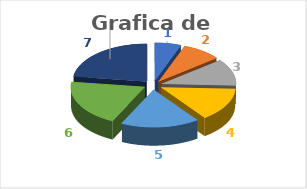
| Category | Series 0 | Series 1 | Series 2 | Series 3 | Series 4 |
|---|---|---|---|---|---|
| 0 | 14 | 20 | 1 | 2 | 7.2 |
| 1 | 21 | 27 | 5 | 10 | 36 |
| 2 | 28 | 34 | 6 | 12 | 43.2 |
| 3 | 35 | 41 | 17 | 34 | 122.4 |
| 4 | 42 | 48 | 10 | 20 | 72 |
| 5 | 49 | 55 | 9 | 18 | 64.8 |
| 6 | 56 | 63 | 2 | 4 | 14.4 |